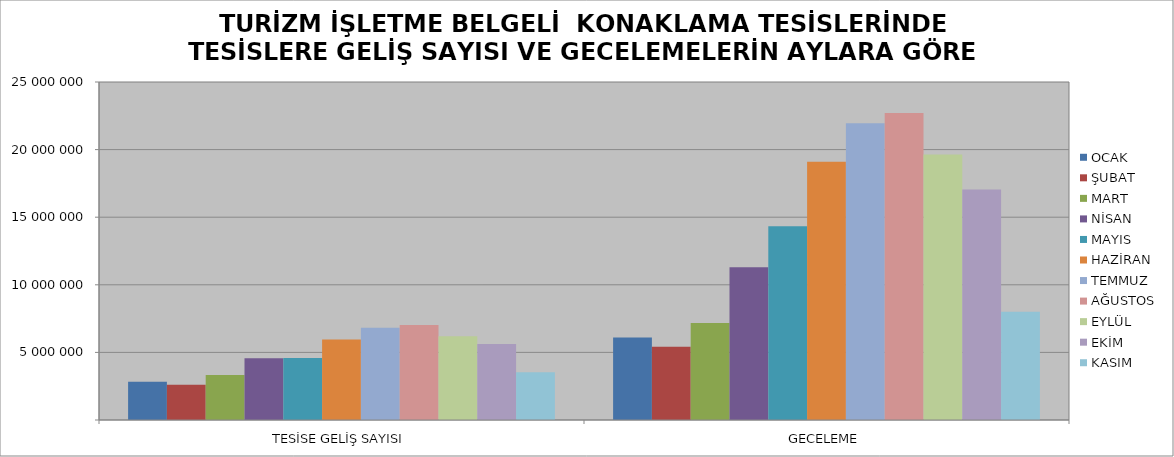
| Category | OCAK | ŞUBAT | MART | NİSAN | MAYIS | HAZİRAN | TEMMUZ | AĞUSTOS | EYLÜL | EKİM | KASIM |
|---|---|---|---|---|---|---|---|---|---|---|---|
| TESİSE GELİŞ SAYISI | 2833509 | 2607189 | 3326719 | 4561709 | 4585981 | 5949977 | 6830740 | 7020795 | 6189605 | 5614434 | 3537887 |
| GECELEME | 6098050 | 5425989 | 7182593 | 11302946 | 14338328 | 19092571 | 21955256 | 22706728 | 19635859 | 17054807 | 8015568 |